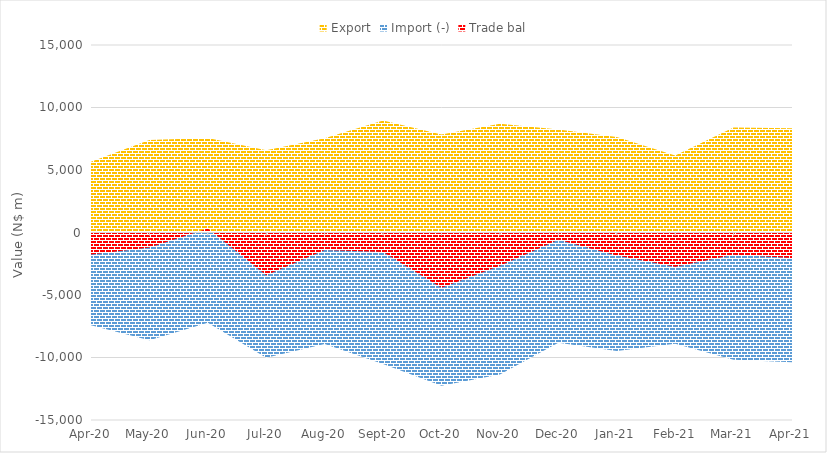
| Category | Export | Import (-) | Trade bal |
|---|---|---|---|
| 2020-04-01 | 5652.681 | -7420.161 | -1767.48 |
| 2020-05-01 | 7405.105 | -8613.111 | -1208.006 |
| 2020-06-01 | 7550.894 | -7225.82 | 325.074 |
| 2020-07-01 | 6582.778 | -10011.058 | -3428.281 |
| 2020-08-01 | 7530.921 | -8928.022 | -1397.101 |
| 2020-09-01 | 8956.343 | -10517.39 | -1561.047 |
| 2020-10-01 | 7839.368 | -12260.854 | -4421.487 |
| 2020-11-01 | 8693.096 | -11361.982 | -2668.886 |
| 2020-12-01 | 8235.884 | -8821.407 | -585.523 |
| 2021-01-01 | 7635.301 | -9480.295 | -1844.994 |
| 2021-02-01 | 6164.142 | -8898.515 | -2734.373 |
| 2021-03-01 | 8408.204 | -10183.477 | -1775.273 |
| 2021-04-01 | 8345.03 | -10389.371 | -2044.341 |